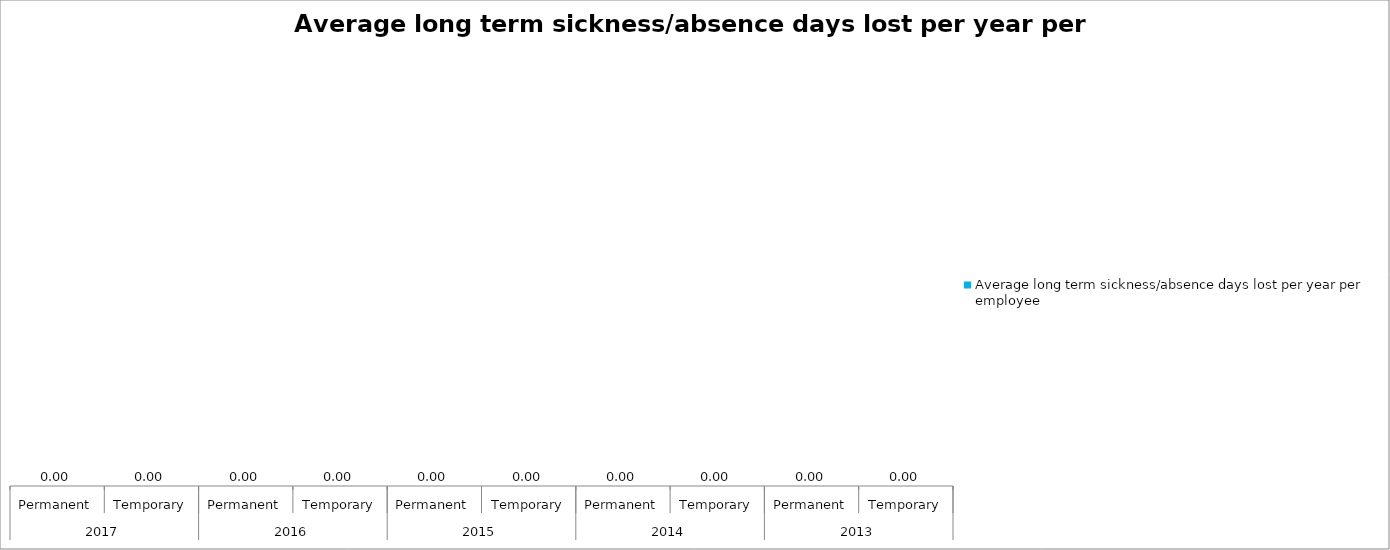
| Category | Average long term sickness/absence days lost per year per employee |
|---|---|
| 0 | 0 |
| 1 | 0 |
| 2 | 0 |
| 3 | 0 |
| 4 | 0 |
| 5 | 0 |
| 6 | 0 |
| 7 | 0 |
| 8 | 0 |
| 9 | 0 |